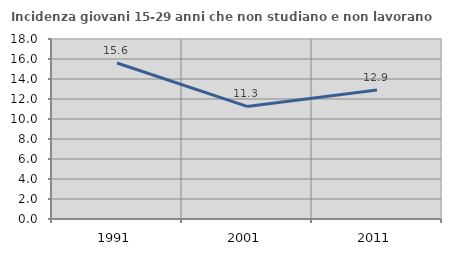
| Category | Incidenza giovani 15-29 anni che non studiano e non lavorano  |
|---|---|
| 1991.0 | 15.596 |
| 2001.0 | 11.259 |
| 2011.0 | 12.903 |